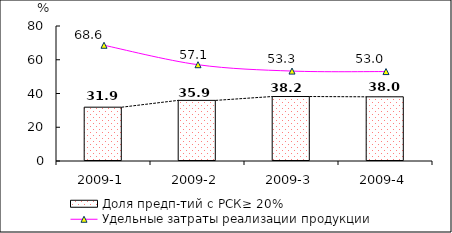
| Category | Доля предп-тий с РСК≥ 20% |
|---|---|
| 2009-1 | 31.89 |
| 2009-2 | 35.93 |
| 2009-3 | 38.21 |
| 2009-4 | 38.04 |